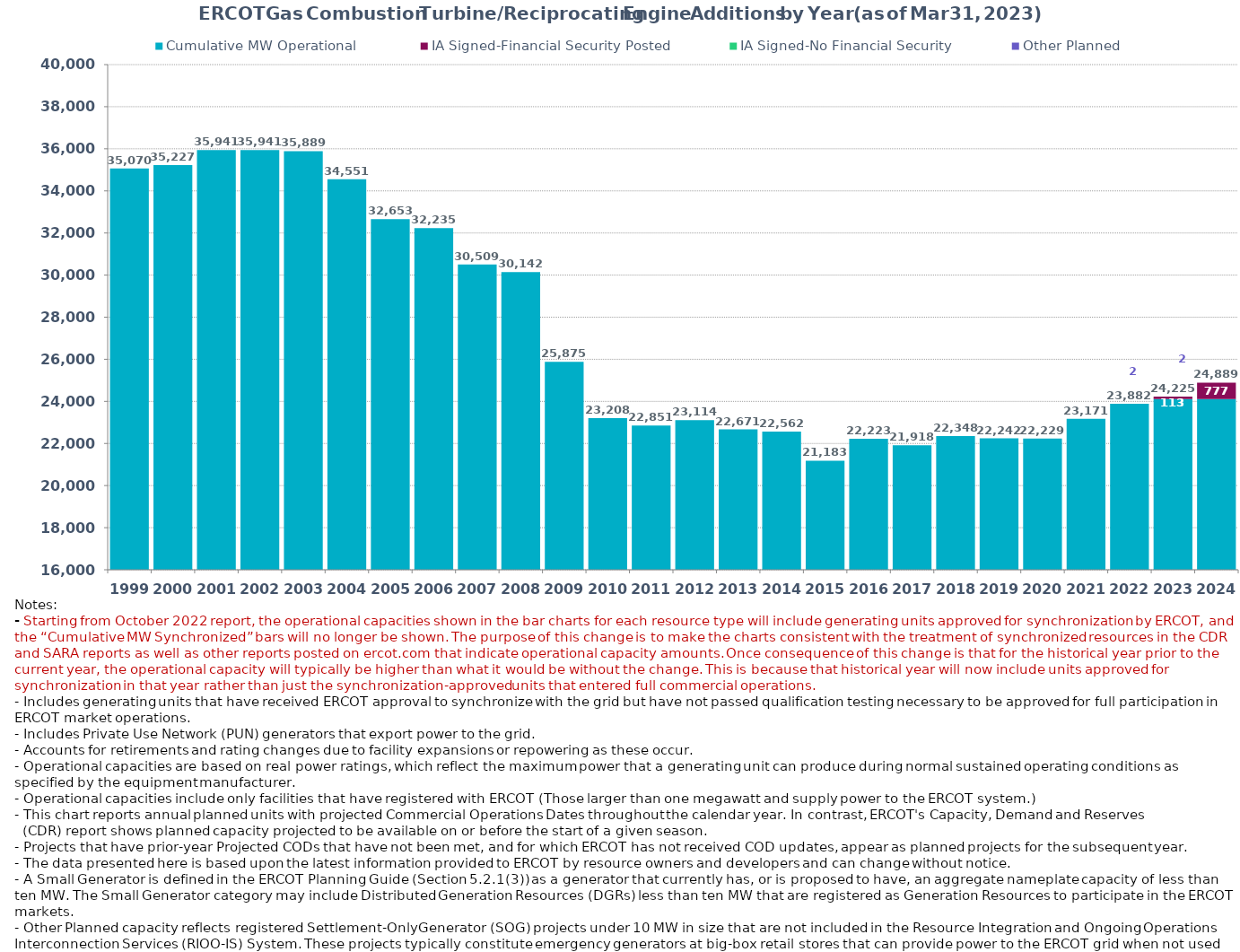
| Category | Cumulative MW Operational  | IA Signed-Financial Security Posted  | IA Signed-No Financial Security  | Other Planned | Cumulative Installed and Planned |
|---|---|---|---|---|---|
| 1999.0 | 35069.87 | 0 | 0 | 0 | 35069.87 |
| 2000.0 | 35227.48 | 0 | 0 | 0 | 35227.48 |
| 2001.0 | 35941.14 | 0 | 0 | 0 | 35941.14 |
| 2002.0 | 35941.14 | 0 | 0 | 0 | 35941.14 |
| 2003.0 | 35889.14 | 0 | 0 | 0 | 35889.14 |
| 2004.0 | 34551.24 | 0 | 0 | 0 | 34551.24 |
| 2005.0 | 32653.04 | 0 | 0 | 0 | 32653.04 |
| 2006.0 | 32235.14 | 0 | 0 | 0 | 32235.14 |
| 2007.0 | 30509.14 | 0 | 0 | 0 | 30509.14 |
| 2008.0 | 30141.94 | 0 | 0 | 0 | 30141.94 |
| 2009.0 | 25875.17 | 0 | 0 | 0 | 25875.17 |
| 2010.0 | 23208.05 | 0 | 0 | 0 | 23208.05 |
| 2011.0 | 22851.35 | 0 | 0 | 0 | 22851.35 |
| 2012.0 | 23113.55 | 0 | 0 | 0 | 23113.55 |
| 2013.0 | 22670.71 | 0 | 0 | 0 | 22670.71 |
| 2014.0 | 22561.71 | 0 | 0 | 0 | 22561.71 |
| 2015.0 | 21182.91 | 0 | 0 | 0 | 21182.91 |
| 2016.0 | 22223.29 | 0 | 0 | 0 | 22223.29 |
| 2017.0 | 21918.43 | 0 | 0 | 0 | 21918.43 |
| 2018.0 | 22347.59 | 0 | 0 | 0 | 22347.59 |
| 2019.0 | 22242.29 | 0 | 0 | 0 | 22242.29 |
| 2020.0 | 22229.29 | 0 | 0 | 0 | 22229.29 |
| 2021.0 | 23171.49 | 0 | 0 | 0 | 23171.49 |
| 2022.0 | 23881.64 | 0 | 0 | 0 | 23881.64 |
| 2023.0 | 24110.79 | 113 | 0 | 1.6 | 24225.39 |
| 2024.0 | 24110.79 | 776.72 | 0 | 1.6 | 24889.11 |